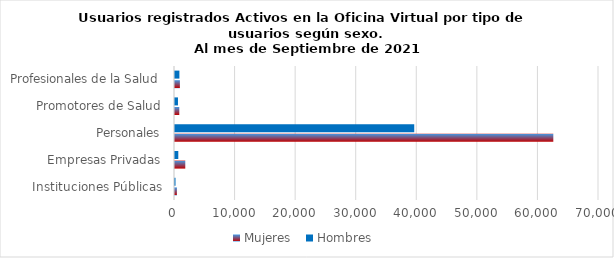
| Category | Mujeres | Hombres |
|---|---|---|
| Instituciones Públicas | 315 | 84 |
| Empresas Privadas | 1697 | 544 |
| Personales | 62457 | 39498 |
| Promotores de Salud | 708 | 490 |
| Profesionales de la Salud | 807 | 727 |